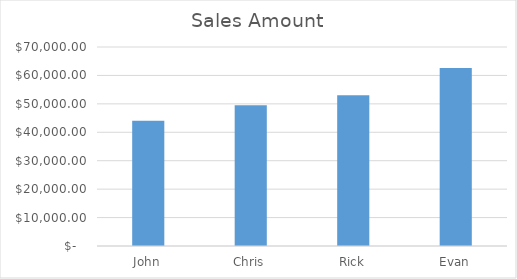
| Category | Sales Amount |
|---|---|
| John | 44080 |
| Chris | 49500 |
| Rick | 53000 |
| Evan | 62600 |